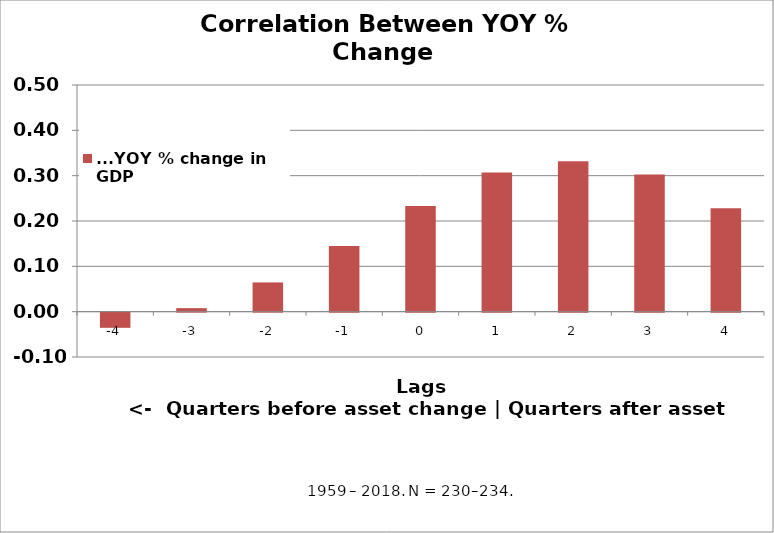
| Category | ...YOY % change in GDP |
|---|---|
| -4.0 | -0.033 |
| -3.0 | 0.008 |
| -2.0 | 0.064 |
| -1.0 | 0.145 |
| 0.0 | 0.233 |
| 1.0 | 0.307 |
| 2.0 | 0.332 |
| 3.0 | 0.303 |
| 4.0 | 0.228 |